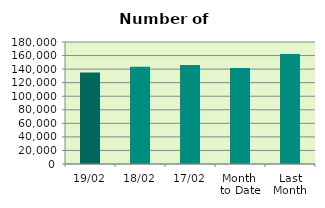
| Category | Series 0 |
|---|---|
| 19/02 | 134848 |
| 18/02 | 143430 |
| 17/02 | 146028 |
| Month 
to Date | 141543.2 |
| Last
Month | 162275.9 |